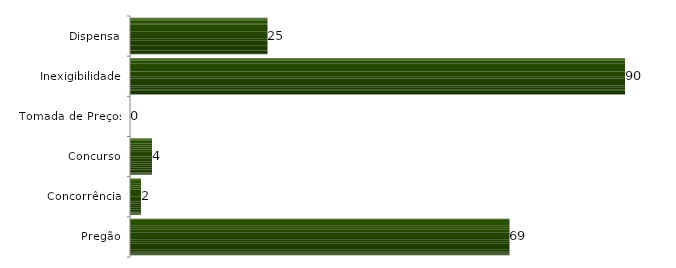
| Category | Series 0 |
|---|---|
| Pregão | 69 |
| Concorrência | 2 |
| Concurso | 4 |
| Tomada de Preços | 0 |
| Inexigibilidade | 90 |
| Dispensa | 25 |